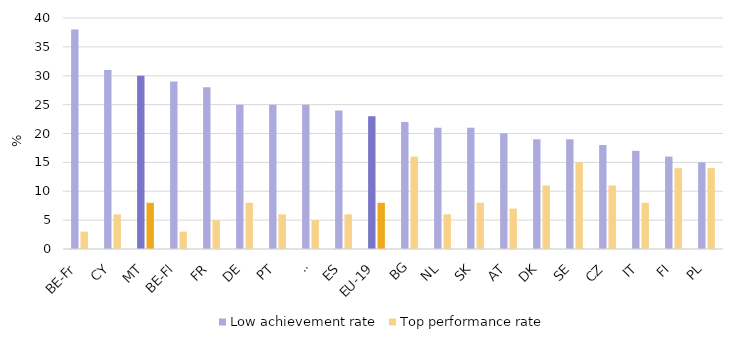
| Category | Low achievement rate | Top performance rate |
|---|---|---|
| BE-Fr | 38 | 3 |
| CY | 31 | 6 |
| MT | 30 | 8 |
| BE-Fl | 29 | 3 |
| FR | 28 | 5 |
| DE | 25 | 8 |
| PT | 25 | 6 |
| SI | 25 | 5 |
| ES | 24 | 6 |
| EU-19 | 23 | 8 |
| BG | 22 | 16 |
| NL | 21 | 6 |
| SK | 21 | 8 |
| AT | 20 | 7 |
| DK | 19 | 11 |
| SE | 19 | 15 |
| CZ | 18 | 11 |
| IT | 17 | 8 |
| FI | 16 | 14 |
| PL | 15 | 14 |